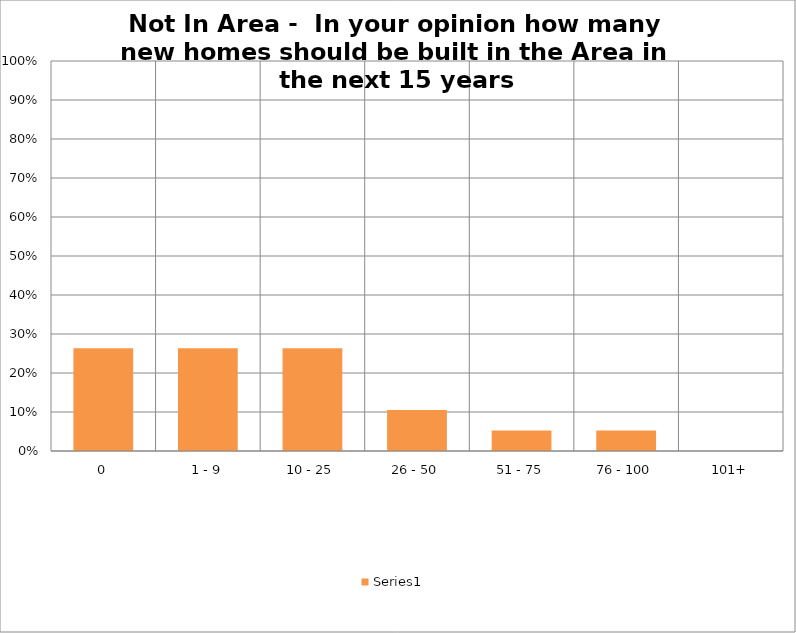
| Category | Series 11 |
|---|---|
| 0 | 0.263 |
| 1 - 9 | 0.263 |
| 10 - 25 | 0.263 |
| 26 - 50 | 0.105 |
| 51 - 75 | 0.053 |
| 76 - 100 | 0.053 |
| 101+ | 0 |